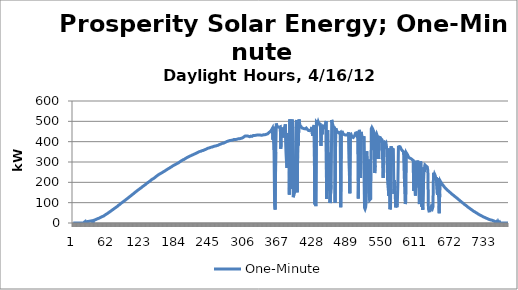
| Category | One-Minute |
|---|---|
| 0 | 0 |
| 1 | 0 |
| 2 | 0 |
| 3 | 0 |
| 4 | 0 |
| 5 | 0 |
| 6 | 0 |
| 7 | 0 |
| 8 | 0 |
| 9 | 0 |
| 10 | 0 |
| 11 | 0 |
| 12 | 0 |
| 13 | 0 |
| 14 | 0 |
| 15 | 0 |
| 16 | 0 |
| 17 | 0 |
| 18 | 0 |
| 19 | 0 |
| 20 | 5 |
| 21 | 0 |
| 22 | 5 |
| 23 | 0 |
| 24 | 0 |
| 25 | 7 |
| 26 | 7 |
| 27 | 8 |
| 28 | 8 |
| 29 | 9 |
| 30 | 9 |
| 31 | 10 |
| 32 | 10 |
| 33 | 11 |
| 34 | 12 |
| 35 | 0 |
| 36 | 13 |
| 37 | 14 |
| 38 | 15 |
| 39 | 16 |
| 40 | 17 |
| 41 | 19 |
| 42 | 20 |
| 43 | 21 |
| 44 | 22 |
| 45 | 23 |
| 46 | 24 |
| 47 | 26 |
| 48 | 27 |
| 49 | 28 |
| 50 | 30 |
| 51 | 31 |
| 52 | 32.405 |
| 53 | 34 |
| 54 | 35 |
| 55 | 37 |
| 56 | 39 |
| 57 | 40 |
| 58 | 43 |
| 59 | 45 |
| 60 | 46 |
| 61 | 48 |
| 62 | 50 |
| 63 | 52 |
| 64 | 54 |
| 65 | 56 |
| 66 | 58 |
| 67 | 60 |
| 68 | 62 |
| 69 | 64 |
| 70 | 66 |
| 71 | 68 |
| 72 | 70 |
| 73 | 72 |
| 74 | 74 |
| 75 | 76 |
| 76 | 78 |
| 77 | 80 |
| 78 | 82 |
| 79 | 85 |
| 80 | 87 |
| 81 | 89 |
| 82 | 91 |
| 83 | 93 |
| 84 | 96 |
| 85 | 98 |
| 86 | 100 |
| 87 | 102 |
| 88 | 104 |
| 89 | 106 |
| 90 | 108 |
| 91 | 110 |
| 92 | 112.566 |
| 93 | 115 |
| 94 | 117 |
| 95 | 119 |
| 96 | 121 |
| 97 | 123 |
| 98 | 125.571 |
| 99 | 127.667 |
| 100 | 130 |
| 101 | 132 |
| 102 | 134 |
| 103 | 136 |
| 104 | 139 |
| 105 | 141 |
| 106 | 143 |
| 107 | 145.578 |
| 108 | 148 |
| 109 | 150 |
| 110 | 152 |
| 111 | 155 |
| 112 | 157 |
| 113 | 159 |
| 114 | 161 |
| 115 | 163 |
| 116 | 165 |
| 117 | 167 |
| 118 | 169.387 |
| 119 | 172 |
| 120 | 173 |
| 121 | 175 |
| 122 | 178 |
| 123 | 180 |
| 124 | 182 |
| 125 | 184 |
| 126 | 186 |
| 127 | 188 |
| 128 | 190 |
| 129 | 193 |
| 130 | 195 |
| 131 | 197 |
| 132 | 199 |
| 133 | 201 |
| 134 | 203 |
| 135 | 206 |
| 136 | 207 |
| 137 | 210 |
| 138 | 212 |
| 139 | 214 |
| 140 | 216 |
| 141 | 217 |
| 142 | 219 |
| 143 | 221 |
| 144 | 223 |
| 145 | 226 |
| 146 | 228 |
| 147 | 230 |
| 148 | 232 |
| 149 | 234 |
| 150 | 236 |
| 151 | 238 |
| 152 | 240 |
| 153 | 241 |
| 154 | 243 |
| 155 | 245 |
| 156 | 246 |
| 157 | 248 |
| 158 | 249.248 |
| 159 | 251 |
| 160 | 253 |
| 161 | 255 |
| 162 | 256 |
| 163 | 258 |
| 164 | 260 |
| 165 | 262 |
| 166 | 263.352 |
| 167 | 265 |
| 168 | 267 |
| 169 | 269 |
| 170 | 270 |
| 171 | 272 |
| 172 | 274 |
| 173 | 275.513 |
| 174 | 277 |
| 175 | 279 |
| 176 | 281 |
| 177 | 282 |
| 178 | 284 |
| 179 | 286 |
| 180 | 287 |
| 181 | 289 |
| 182 | 290 |
| 183 | 292 |
| 184 | 293 |
| 185 | 295 |
| 186 | 296 |
| 187 | 298 |
| 188 | 300 |
| 189 | 302 |
| 190 | 304 |
| 191 | 306 |
| 192 | 307.479 |
| 193 | 309 |
| 194 | 310.528 |
| 195 | 311 |
| 196 | 313 |
| 197 | 314 |
| 198 | 316.623 |
| 199 | 318 |
| 200 | 320 |
| 201 | 321.629 |
| 202 | 323 |
| 203 | 324.662 |
| 204 | 326 |
| 205 | 327 |
| 206 | 329 |
| 207 | 330 |
| 208 | 331 |
| 209 | 332 |
| 210 | 334 |
| 211 | 335 |
| 212 | 336 |
| 213 | 338 |
| 214 | 339 |
| 215 | 340 |
| 216 | 341 |
| 217 | 342.538 |
| 218 | 344 |
| 219 | 345 |
| 220 | 347 |
| 221 | 348.576 |
| 222 | 350 |
| 223 | 351 |
| 224 | 352 |
| 225 | 353 |
| 226 | 353.204 |
| 227 | 355 |
| 228 | 356 |
| 229 | 356 |
| 230 | 357 |
| 231 | 358 |
| 232 | 360 |
| 233 | 361 |
| 234 | 362 |
| 235 | 363 |
| 236 | 364.503 |
| 237 | 366 |
| 238 | 367.561 |
| 239 | 368 |
| 240 | 369 |
| 241 | 370 |
| 242 | 371 |
| 243 | 372 |
| 244 | 373 |
| 245 | 374 |
| 246 | 374 |
| 247 | 375 |
| 248 | 376.667 |
| 249 | 377 |
| 250 | 378 |
| 251 | 378 |
| 252 | 379 |
| 253 | 380 |
| 254 | 381 |
| 255 | 382 |
| 256 | 382.317 |
| 257 | 384 |
| 258 | 385.398 |
| 259 | 387 |
| 260 | 387.412 |
| 261 | 389 |
| 262 | 390 |
| 263 | 391 |
| 264 | 392 |
| 265 | 393 |
| 266 | 393 |
| 267 | 394 |
| 268 | 396 |
| 269 | 397 |
| 270 | 398.274 |
| 271 | 400 |
| 272 | 401.308 |
| 273 | 402.308 |
| 274 | 403 |
| 275 | 404 |
| 276 | 405 |
| 277 | 405 |
| 278 | 406 |
| 279 | 407 |
| 280 | 407 |
| 281 | 407 |
| 282 | 408 |
| 283 | 410 |
| 284 | 411 |
| 285 | 411 |
| 286 | 411 |
| 287 | 411 |
| 288 | 411 |
| 289 | 412 |
| 290 | 412.563 |
| 291 | 413 |
| 292 | 414 |
| 293 | 414 |
| 294 | 414 |
| 295 | 415 |
| 296 | 416 |
| 297 | 417 |
| 298 | 417 |
| 299 | 418 |
| 300 | 420 |
| 301 | 422 |
| 302 | 424 |
| 303 | 427 |
| 304 | 428 |
| 305 | 427 |
| 306 | 428 |
| 307 | 428 |
| 308 | 428 |
| 309 | 428 |
| 310 | 426.275 |
| 311 | 425 |
| 312 | 424.291 |
| 313 | 426 |
| 314 | 427.308 |
| 315 | 427 |
| 316 | 426 |
| 317 | 429 |
| 318 | 430 |
| 319 | 430 |
| 320 | 430 |
| 321 | 430.412 |
| 322 | 431 |
| 323 | 431 |
| 324 | 432 |
| 325 | 433 |
| 326 | 433 |
| 327 | 433 |
| 328 | 433 |
| 329 | 432 |
| 330 | 432.454 |
| 331 | 431.454 |
| 332 | 432 |
| 333 | 432 |
| 334 | 432 |
| 335 | 433 |
| 336 | 433.458 |
| 337 | 433 |
| 338 | 433.492 |
| 339 | 434.482 |
| 340 | 435 |
| 341 | 436 |
| 342 | 437 |
| 343 | 437 |
| 344 | 439 |
| 345 | 441 |
| 346 | 445 |
| 347 | 447 |
| 348 | 449 |
| 349 | 452 |
| 350 | 455 |
| 351 | 458 |
| 352 | 465 |
| 353 | 409.62 |
| 354 | 473 |
| 355 | 359 |
| 356 | 92 |
| 357 | 66 |
| 358 | 349 |
| 359 | 489.333 |
| 360 | 477 |
| 361 | 473 |
| 362 | 472 |
| 363 | 471 |
| 364 | 470.415 |
| 365 | 471 |
| 366 | 473 |
| 367 | 365.336 |
| 368 | 465 |
| 369 | 463 |
| 370 | 463 |
| 371 | 467.472 |
| 372 | 465.12 |
| 373 | 420.18 |
| 374 | 472.508 |
| 375 | 485.054 |
| 376 | 488.157 |
| 377 | 305.806 |
| 378 | 270.489 |
| 379 | 416.04 |
| 380 | 442.252 |
| 381 | 429.58 |
| 382 | 139.575 |
| 383 | 509 |
| 384 | 377.512 |
| 385 | 167.592 |
| 386 | 181.372 |
| 387 | 509 |
| 388 | 466.95 |
| 389 | 127 |
| 390 | 138 |
| 391 | 137 |
| 392 | 155.779 |
| 393 | 326.801 |
| 394 | 492.265 |
| 395 | 506.51 |
| 396 | 151.745 |
| 397 | 402.134 |
| 398 | 381.547 |
| 399 | 509 |
| 400 | 493 |
| 401 | 480 |
| 402 | 477 |
| 403 | 474 |
| 404 | 468 |
| 405 | 467 |
| 406 | 466 |
| 407 | 465 |
| 408 | 464 |
| 409 | 461 |
| 410 | 463 |
| 411 | 464 |
| 412 | 467 |
| 413 | 465 |
| 414 | 460 |
| 415 | 458 |
| 416 | 455 |
| 417 | 455 |
| 418 | 454 |
| 419 | 453.517 |
| 420 | 456.517 |
| 421 | 456 |
| 422 | 472.498 |
| 423 | 429.548 |
| 424 | 466.435 |
| 425 | 469 |
| 426 | 481.614 |
| 427 | 91 |
| 428 | 96.323 |
| 429 | 83 |
| 430 | 495.699 |
| 431 | 491 |
| 432 | 489 |
| 433 | 498 |
| 434 | 490.25 |
| 435 | 492 |
| 436 | 488 |
| 437 | 479 |
| 438 | 379.359 |
| 439 | 478.321 |
| 440 | 435.852 |
| 441 | 476 |
| 442 | 472.323 |
| 443 | 471 |
| 444 | 476 |
| 445 | 476 |
| 446 | 468.254 |
| 447 | 502.19 |
| 448 | 117.563 |
| 449 | 429.16 |
| 450 | 456.556 |
| 451 | 158.794 |
| 452 | 160.459 |
| 453 | 345.36 |
| 454 | 98 |
| 455 | 98 |
| 456 | 186.214 |
| 457 | 507.012 |
| 458 | 493 |
| 459 | 481.256 |
| 460 | 474 |
| 461 | 470.468 |
| 462 | 468.466 |
| 463 | 100.136 |
| 464 | 465 |
| 465 | 458.464 |
| 466 | 453 |
| 467 | 448.462 |
| 468 | 446 |
| 469 | 442 |
| 470 | 442 |
| 471 | 445 |
| 472 | 446 |
| 473 | 77.342 |
| 474 | 446 |
| 475 | 445.987 |
| 476 | 447 |
| 477 | 439 |
| 478 | 437 |
| 479 | 435 |
| 480 | 436 |
| 481 | 433 |
| 482 | 432.661 |
| 483 | 433 |
| 484 | 433 |
| 485 | 434 |
| 486 | 438 |
| 487 | 445.643 |
| 488 | 441 |
| 489 | 146.58 |
| 490 | 443 |
| 491 | 437 |
| 492 | 430 |
| 493 | 424 |
| 494 | 420 |
| 495 | 420.554 |
| 496 | 424 |
| 497 | 427 |
| 498 | 433 |
| 499 | 442 |
| 500 | 442.878 |
| 501 | 444.092 |
| 502 | 446.529 |
| 503 | 415.587 |
| 504 | 120.904 |
| 505 | 420.978 |
| 506 | 458 |
| 507 | 387.07 |
| 508 | 221.77 |
| 509 | 447.914 |
| 510 | 433 |
| 511 | 423 |
| 512 | 422 |
| 513 | 420 |
| 514 | 426.406 |
| 515 | 75.61 |
| 516 | 69 |
| 517 | 78 |
| 518 | 107.65 |
| 519 | 353.32 |
| 520 | 217.423 |
| 521 | 281.703 |
| 522 | 312.191 |
| 523 | 147.984 |
| 524 | 113 |
| 525 | 117 |
| 526 | 119 |
| 527 | 463.688 |
| 528 | 470 |
| 529 | 465 |
| 530 | 463 |
| 531 | 452.365 |
| 532 | 363.468 |
| 533 | 245.569 |
| 534 | 282.848 |
| 535 | 435.399 |
| 536 | 441 |
| 537 | 433 |
| 538 | 434 |
| 539 | 405.202 |
| 540 | 315.074 |
| 541 | 422.09 |
| 542 | 425 |
| 543 | 420 |
| 544 | 415 |
| 545 | 413 |
| 546 | 409 |
| 547 | 407 |
| 548 | 221.044 |
| 549 | 405 |
| 550 | 389 |
| 551 | 383.514 |
| 552 | 387 |
| 553 | 392 |
| 554 | 372.406 |
| 555 | 371 |
| 556 | 198.384 |
| 557 | 202.08 |
| 558 | 133.804 |
| 559 | 366.07 |
| 560 | 67.586 |
| 561 | 74.304 |
| 562 | 377.381 |
| 563 | 352.38 |
| 564 | 365 |
| 565 | 363.668 |
| 566 | 362 |
| 567 | 142.64 |
| 568 | 209.364 |
| 569 | 170.17 |
| 570 | 77 |
| 571 | 106.745 |
| 572 | 78 |
| 573 | 94.68 |
| 574 | 191.67 |
| 575 | 380.352 |
| 576 | 373.264 |
| 577 | 369.724 |
| 578 | 374 |
| 579 | 372.423 |
| 580 | 362.455 |
| 581 | 362 |
| 582 | 355 |
| 583 | 353 |
| 584 | 351 |
| 585 | 350 |
| 586 | 173.1 |
| 587 | 93.462 |
| 588 | 104.72 |
| 589 | 345 |
| 590 | 343 |
| 591 | 336 |
| 592 | 329 |
| 593 | 324 |
| 594 | 323 |
| 595 | 319 |
| 596 | 317.596 |
| 597 | 317 |
| 598 | 315 |
| 599 | 312 |
| 600 | 309.428 |
| 601 | 308 |
| 602 | 157.767 |
| 603 | 306 |
| 604 | 304 |
| 605 | 135 |
| 606 | 235.137 |
| 607 | 189.407 |
| 608 | 282.568 |
| 609 | 307 |
| 610 | 310 |
| 611 | 174 |
| 612 | 93 |
| 613 | 217.01 |
| 614 | 303 |
| 615 | 294.104 |
| 616 | 79.415 |
| 617 | 111.864 |
| 618 | 65 |
| 619 | 64 |
| 620 | 274.398 |
| 621 | 252.3 |
| 622 | 285 |
| 623 | 282 |
| 624 | 280 |
| 625 | 277 |
| 626 | 275 |
| 627 | 256.418 |
| 628 | 70.603 |
| 629 | 59 |
| 630 | 58 |
| 631 | 60 |
| 632 | 62 |
| 633 | 79.529 |
| 634 | 81.517 |
| 635 | 70.53 |
| 636 | 79.086 |
| 637 | 247 |
| 638 | 225.982 |
| 639 | 240 |
| 640 | 234 |
| 641 | 219.596 |
| 642 | 226 |
| 643 | 225 |
| 644 | 139.079 |
| 645 | 221 |
| 646 | 129.285 |
| 647 | 48 |
| 648 | 143.953 |
| 649 | 206 |
| 650 | 201 |
| 651 | 197 |
| 652 | 192 |
| 653 | 188 |
| 654 | 185 |
| 655 | 181 |
| 656 | 178 |
| 657 | 174 |
| 658 | 171 |
| 659 | 168 |
| 660 | 166 |
| 661 | 163 |
| 662 | 160 |
| 663 | 158 |
| 664 | 156 |
| 665 | 153 |
| 666 | 151 |
| 667 | 148 |
| 668 | 146 |
| 669 | 143 |
| 670 | 141 |
| 671 | 139 |
| 672 | 137 |
| 673 | 135 |
| 674 | 132 |
| 675 | 130 |
| 676 | 128 |
| 677 | 125.371 |
| 678 | 123 |
| 679 | 121 |
| 680 | 119 |
| 681 | 117 |
| 682 | 114 |
| 683 | 112 |
| 684 | 109 |
| 685 | 107 |
| 686 | 105 |
| 687 | 102.671 |
| 688 | 100 |
| 689 | 98 |
| 690 | 96 |
| 691 | 93 |
| 692 | 91 |
| 693 | 89 |
| 694 | 87 |
| 695 | 85 |
| 696 | 83 |
| 697 | 81 |
| 698 | 78 |
| 699 | 76 |
| 700 | 74 |
| 701 | 72 |
| 702 | 70 |
| 703 | 68 |
| 704 | 66 |
| 705 | 64 |
| 706 | 62 |
| 707 | 60 |
| 708 | 58 |
| 709 | 56 |
| 710 | 55 |
| 711 | 53 |
| 712 | 51 |
| 713 | 49 |
| 714 | 48 |
| 715 | 46 |
| 716 | 44 |
| 717 | 43 |
| 718 | 41 |
| 719 | 39 |
| 720 | 38 |
| 721 | 36 |
| 722 | 35 |
| 723 | 33 |
| 724 | 32 |
| 725 | 31 |
| 726 | 29 |
| 727 | 28 |
| 728 | 27 |
| 729 | 25 |
| 730 | 24 |
| 731 | 23 |
| 732 | 22 |
| 733 | 20 |
| 734 | 19 |
| 735 | 18 |
| 736 | 17 |
| 737 | 16 |
| 738 | 15 |
| 739 | 14 |
| 740 | 14 |
| 741 | 13 |
| 742 | 12 |
| 743 | 11 |
| 744 | 10 |
| 745 | 10 |
| 746 | 5 |
| 747 | 9 |
| 748 | 8 |
| 749 | 8 |
| 750 | 0 |
| 751 | 6.642 |
| 752 | 0 |
| 753 | 0 |
| 754 | 5 |
| 755 | 0 |
| 756 | 0 |
| 757 | 0 |
| 758 | 0 |
| 759 | 0 |
| 760 | 0 |
| 761 | 0 |
| 762 | 0 |
| 763 | 0 |
| 764 | 0 |
| 765 | 0 |
| 766 | 0 |
| 767 | 0 |
| 768 | 0 |
| 769 | 0 |
| 770 | 0 |